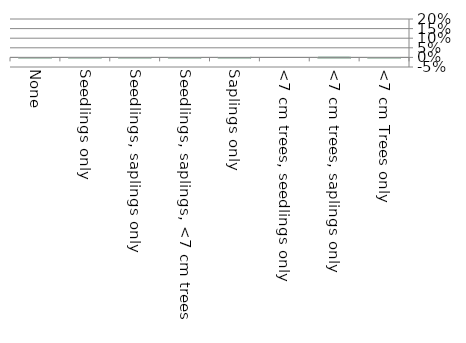
| Category | Near native & fragments |
|---|---|
| None | 0.002 |
| Seedlings only | 0 |
| Seedlings, saplings only | 0.002 |
| Seedlings, saplings, <7 cm trees | 0.002 |
| Saplings only | 0.005 |
| <7 cm trees, seedlings only | 0 |
| <7 cm trees, saplings only | 0.006 |
| <7 cm Trees only | 0.001 |